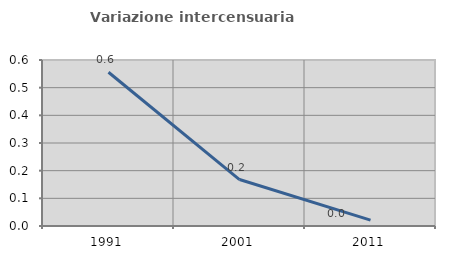
| Category | Variazione intercensuaria annua |
|---|---|
| 1991.0 | 0.556 |
| 2001.0 | 0.168 |
| 2011.0 | 0.021 |